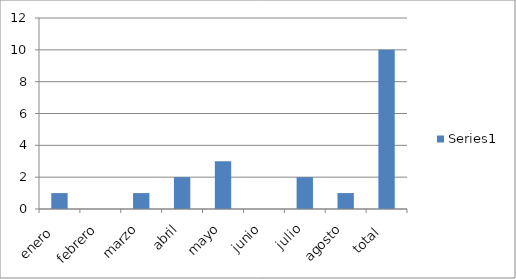
| Category | Series 0 |
|---|---|
| enero  | 1 |
| febrero | 0 |
| marzo | 1 |
| abril | 2 |
| mayo | 3 |
| junio | 0 |
| julio | 2 |
| agosto | 1 |
| total  | 10 |